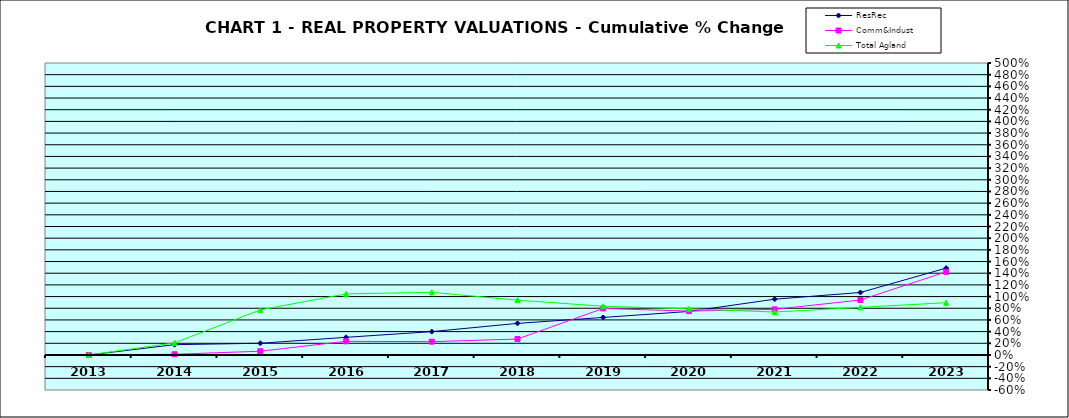
| Category | ResRec | Comm&Indust | Total Agland |
|---|---|---|---|
| 2013.0 | 0 | 0 | 0 |
| 2014.0 | 0.176 | 0.012 | 0.207 |
| 2015.0 | 0.201 | 0.064 | 0.772 |
| 2016.0 | 0.302 | 0.234 | 1.046 |
| 2017.0 | 0.4 | 0.228 | 1.073 |
| 2018.0 | 0.541 | 0.273 | 0.939 |
| 2019.0 | 0.643 | 0.797 | 0.834 |
| 2020.0 | 0.745 | 0.751 | 0.79 |
| 2021.0 | 0.955 | 0.782 | 0.735 |
| 2022.0 | 1.07 | 0.941 | 0.815 |
| 2023.0 | 1.487 | 1.423 | 0.895 |